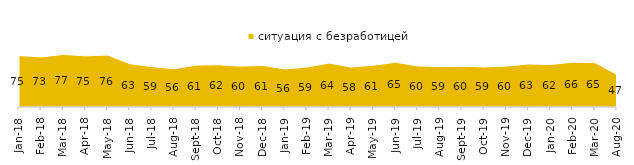
| Category | ситуация с безработицей |
|---|---|
| 2018-01-01 | 75.4 |
| 2018-02-01 | 73.25 |
| 2018-03-01 | 76.95 |
| 2018-04-01 | 74.85 |
| 2018-05-01 | 76 |
| 2018-06-01 | 63.4 |
| 2018-07-01 | 59 |
| 2018-08-01 | 56 |
| 2018-09-01 | 61.35 |
| 2018-10-01 | 61.75 |
| 2018-11-01 | 59.78 |
| 2018-12-01 | 60.95 |
| 2019-01-01 | 55.55 |
| 2019-02-01 | 58.5 |
| 2019-03-01 | 64.296 |
| 2019-04-01 | 58.416 |
| 2019-05-01 | 61.169 |
| 2019-06-01 | 65.436 |
| 2019-07-01 | 60.099 |
| 2019-08-01 | 59.241 |
| 2019-09-01 | 59.703 |
| 2019-10-01 | 58.614 |
| 2019-11-01 | 59.851 |
| 2019-12-01 | 63.02 |
| 2020-01-01 | 62.129 |
| 2020-02-01 | 65.594 |
| 2020-03-01 | 64.998 |
| 2020-08-01 | 47.418 |